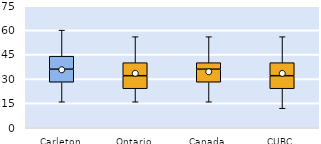
| Category | 25th | 50th | 75th |
|---|---|---|---|
| Carleton | 28 | 8 | 8 |
| Ontario | 24 | 8 | 8 |
| Canada | 28 | 8 | 4 |
| CUBC | 24 | 8 | 8 |